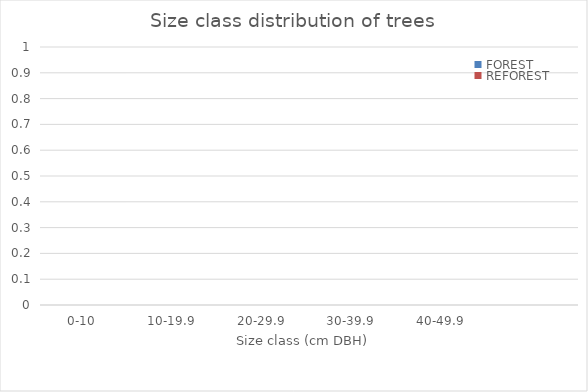
| Category | FOREST | REFOREST |
|---|---|---|
| 0-10  | 0 | 0 |
| 10-19.9  | 0 | 0 |
| 20-29.9  | 0 | 0 |
| 30-39.9  | 0 | 0 |
| 40-49.9  | 0 | 0 |